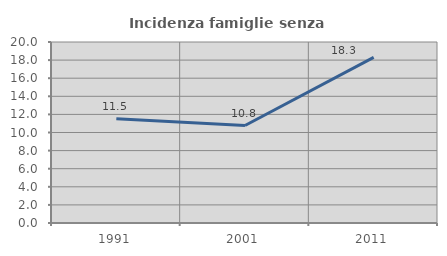
| Category | Incidenza famiglie senza nuclei |
|---|---|
| 1991.0 | 11.52 |
| 2001.0 | 10.772 |
| 2011.0 | 18.297 |